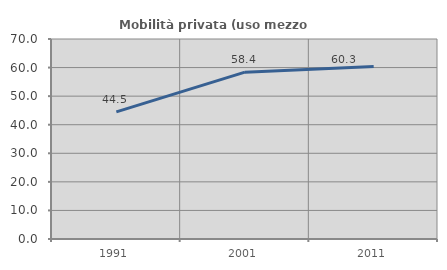
| Category | Mobilità privata (uso mezzo privato) |
|---|---|
| 1991.0 | 44.503 |
| 2001.0 | 58.398 |
| 2011.0 | 60.335 |